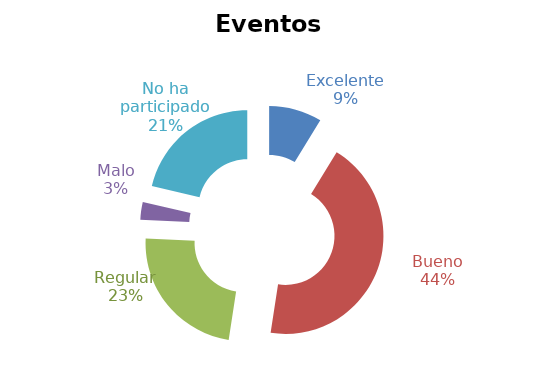
| Category | Series 0 |
|---|---|
| Excelente | 0.087 |
| Bueno | 0.437 |
| Regular | 0.233 |
| Malo | 0.029 |
| No ha participado | 0.214 |